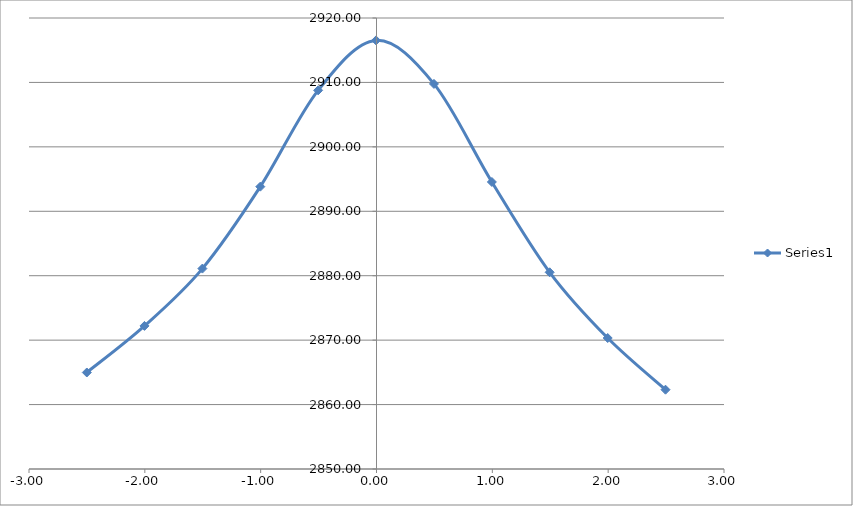
| Category | Series 0 |
|---|---|
| -2.5010000000000003 | 2864.979 |
| -2.003 | 2872.209 |
| -1.5030000000000001 | 2881.106 |
| -1.0030000000000001 | 2893.821 |
| -0.5040000000000004 | 2908.771 |
| -0.004000000000000448 | 2916.523 |
| 0.49599999999999955 | 2909.77 |
| 0.9959999999999996 | 2894.552 |
| 1.495 | 2880.529 |
| 1.9959999999999996 | 2870.33 |
| 2.495 | 2862.309 |